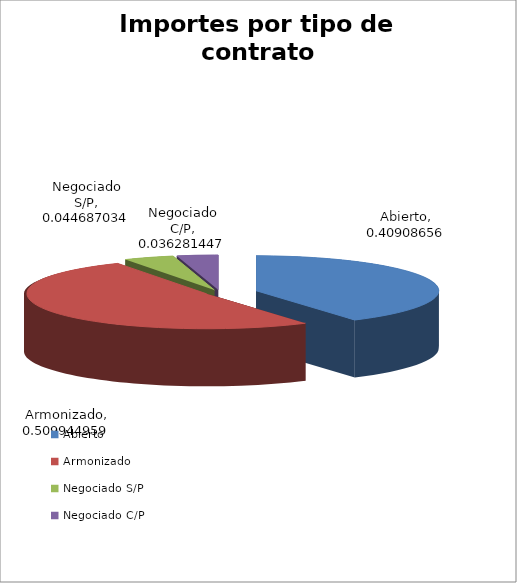
| Category | Procedimiento de adjudicación | Abierto Armonizado Negociado S/P |
|---|---|---|
| Abierto | 0.409 |  |
| Armonizado | 0.51 |  |
| Negociado S/P | 0.045 |  |
| Negociado C/P | 0.036 |  |